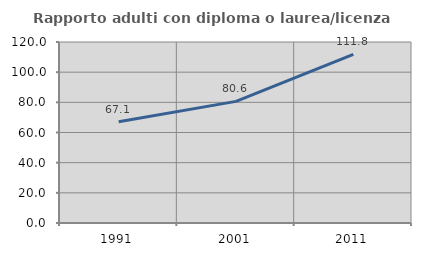
| Category | Rapporto adulti con diploma o laurea/licenza media  |
|---|---|
| 1991.0 | 67.127 |
| 2001.0 | 80.645 |
| 2011.0 | 111.775 |